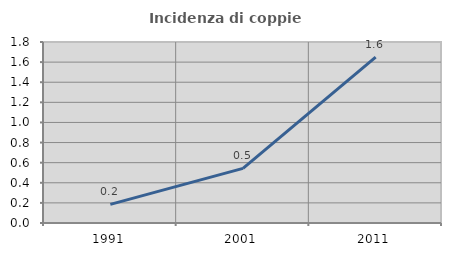
| Category | Incidenza di coppie miste |
|---|---|
| 1991.0 | 0.186 |
| 2001.0 | 0.543 |
| 2011.0 | 1.649 |